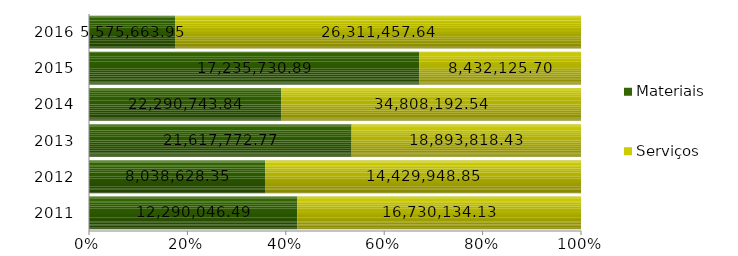
| Category | Materiais | Serviços |
|---|---|---|
| 2011.0 | 12290046.49 | 16730134.13 |
| 2012.0 | 8038628.35 | 14429948.85 |
| 2013.0 | 21617772.77 | 18893818.43 |
| 2014.0 | 22290743.84 | 34808192.54 |
| 2015.0 | 17235730.89 | 8432125.7 |
| 2016.0 | 5575663.95 | 26311457.64 |